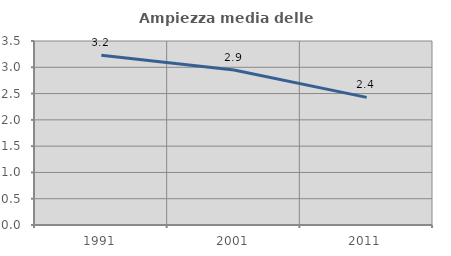
| Category | Ampiezza media delle famiglie |
|---|---|
| 1991.0 | 3.228 |
| 2001.0 | 2.947 |
| 2011.0 | 2.428 |